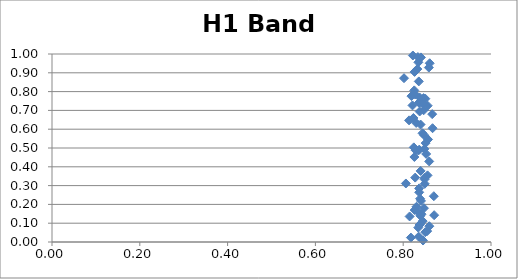
| Category | H1 Band 4 |
|---|---|
| 0.8018493176403366 | 0.871 |
| 0.80607384298247 | 0.311 |
| 0.8133962390033009 | 0.647 |
| 0.8146392819198448 | 0.136 |
| 0.8175393427745514 | 0.023 |
| 0.8187732143308741 | 0.776 |
| 0.8211496641435778 | 0.726 |
| 0.822047826347537 | 0.992 |
| 0.8232573474126851 | 0.66 |
| 0.8234255376409202 | 0.785 |
| 0.8241519272544026 | 0.503 |
| 0.8252342222584177 | 0.806 |
| 0.8255240990793956 | 0.452 |
| 0.8259320870467077 | 0.905 |
| 0.8261253931030366 | 0.17 |
| 0.827325429055415 | 0.343 |
| 0.8274922939253511 | 0.785 |
| 0.8282129414663207 | 0.488 |
| 0.8295741860157224 | 0.633 |
| 0.829978904605346 | 0.187 |
| 0.8323041310196968 | 0.92 |
| 0.8331827128560072 | 0.161 |
| 0.8335030369271555 | 0.984 |
| 0.8343656725484362 | 0.487 |
| 0.8343794209239799 | 0.076 |
| 0.8345301516304345 | 0.956 |
| 0.8352404636185572 | 0.028 |
| 0.8355593997653347 | 0.854 |
| 0.8357234624169804 | 0.741 |
| 0.8362986531304855 | 0.285 |
| 0.8364319704725586 | 0.265 |
| 0.8365820429519361 | 0.491 |
| 0.8371698394042479 | 0.09 |
| 0.8374874557641412 | 0.694 |
| 0.837770117947575 | 0.768 |
| 0.838342769200135 | 0.74 |
| 0.8383564005186456 | 0.094 |
| 0.8385058471271969 | 0.23 |
| 0.8392100895714747 | 0.139 |
| 0.8395262905988745 | 0.625 |
| 0.8396889439062881 | 0.378 |
| 0.8403913470388022 | 0.982 |
| 0.8405401225109596 | 0.218 |
| 0.8417178812397303 | 0.148 |
| 0.843984930117632 | 0.578 |
| 0.8443772269393203 | 0.111 |
| 0.8448412858677113 | 0.737 |
| 0.8452328039576612 | 0.008 |
| 0.8463845683337314 | 0.765 |
| 0.8465446898535544 | 0.701 |
| 0.8472361266887317 | 0.18 |
| 0.8478773061844884 | 0.568 |
| 0.8482660251045098 | 0.495 |
| 0.8485418033265524 | 0.342 |
| 0.8487258388853264 | 0.333 |
| 0.8491137646427557 | 0.309 |
| 0.8502549036408382 | 0.052 |
| 0.8504135411676331 | 0.762 |
| 0.8510985506001106 | 0.526 |
| 0.85239200442786 | 0.468 |
| 0.8546018115650037 | 0.058 |
| 0.8554363100023183 | 0.354 |
| 0.8557404966328584 | 0.725 |
| 0.8565725514413565 | 0.545 |
| 0.8583937864879279 | 0.928 |
| 0.8592200696576338 | 0.429 |
| 0.8595212496012887 | 0.084 |
| 0.8603450468712057 | 0.951 |
| 0.8660456734593985 | 0.68 |
| 0.8668546828563586 | 0.605 |
| 0.8697206197058698 | 0.244 |
| 0.8705209872297011 | 0.143 |